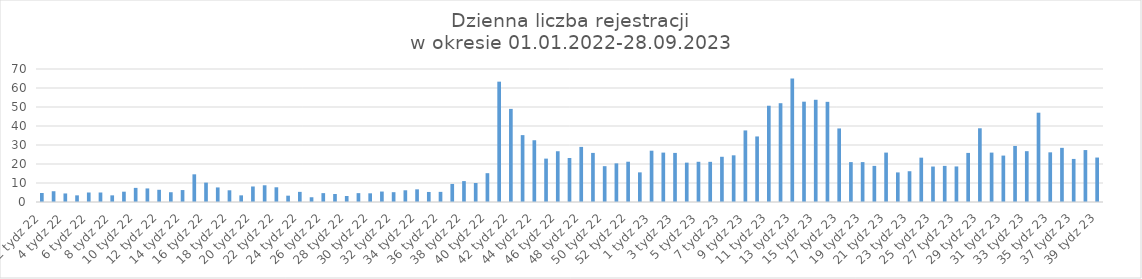
| Category | Series 0 |
|---|---|
| 2 tydz 22 | 4.75 |
| 3 tydz 22 | 5.667 |
| 4 tydz 22 | 4.5 |
| 5 tydz 22 | 3.5 |
| 6 tydz 22 | 5 |
| 7 tydz 22 | 5 |
| 8 tydz 22 | 3.5 |
| 9 tydz 22 | 5.429 |
| 10 tydz 22 | 7.429 |
| 11 tydz 22 | 7.143 |
| 12 tydz 22 | 6.429 |
| 13 tydz 22 | 5.143 |
| 14 tydz 22 | 6.286 |
| 15 tydz 22 | 14.571 |
| 16 tydz 22 | 10.2 |
| 17 tydz 22 | 7.667 |
| 18 tydz 22 | 6.167 |
| 19 tydz 22 | 3.5 |
| 20 tydz 22 | 8.167 |
| 21 tydz 22 | 8.8 |
| 22 tydz 22 | 7.75 |
| 23 tydz 22 | 3.333 |
| 24 tydz 22 | 5.333 |
| 25 tydz 22 | 2.5 |
| 26 tydz 22 | 4.667 |
| 27 tydz 22 | 4.2 |
| 28 tydz 22 | 3.167 |
| 29 tydz 22 | 4.667 |
| 30 tydz 22 | 4.571 |
| 31 tydz 22 | 5.5 |
| 32 tydz 22 | 5.167 |
| 33 tydz 22 | 6.167 |
| 34 tydz 22 | 6.667 |
| 35 tydz 22 | 5.286 |
| 36 tydz 22 | 5.333 |
| 37 tydz 22 | 9.5 |
| 38 tydz 22 | 11 |
| 39 tydz 22 | 10 |
| 40 tydz 22 | 15.167 |
| 41 tydz 22 | 63.333 |
| 42 tydz 22 | 49 |
| 43 tydz 22 | 35.2 |
| 44 tydz 22 | 32.5 |
| 45 tydz 22 | 22.833 |
| 46 tydz 22 | 26.714 |
| 47 tydz 22 | 23.167 |
| 48 tydz 22 | 29 |
| 49 tydz 22 | 25.833 |
| 50 tydz 22 | 18.857 |
| 51 tydz 22 | 20.333 |
| 52 tydz 22 | 21.2 |
| 53 tydz 22 | 15.6 |
| 1 tydz 23 | 27 |
| 2 tydz 23 | 26 |
| 3 tydz 23 | 25.833 |
| 4 tydz 23 | 20.714 |
| 5 tydz 23 | 21.167 |
| 6 tydz 23 | 21.143 |
| 7 tydz 23 | 23.8 |
| 8 tydz 23 | 24.571 |
| 9 tydz 23 | 37.667 |
| 10 tydz 23 | 34.5 |
| 11 tydz 23 | 50.667 |
| 12 tydz 23 | 52 |
| 13 tydz 23 | 65 |
| 14 tydz 23 | 52.8 |
| 15 tydz 23 | 53.8 |
| 16 tydz 23 | 52.714 |
| 17 tydz 23 | 38.714 |
| 18 tydz 23 | 21 |
| 19 tydz 23 | 21 |
| 20 tydz 23 | 19 |
| 21 tydz 23 | 26 |
| 22 tydz 23 | 15.571 |
| 23 tydz 23 | 16.2 |
| 24 tydz 23 | 23.333 |
| 25 tydz 23 | 18.667 |
| 26 tydz 23 | 19 |
| 27 tydz 23 | 18.714 |
| 28 tydz 23 | 25.833 |
| 29 tydz 23 | 38.8 |
| 30 tydz 23 | 26 |
| 31 tydz 23 | 24.429 |
| 32 tydz 23 | 29.5 |
| 33 tydz 23 | 26.75 |
| 34 tydz 23 | 47 |
| 35 tydz 23 | 26.143 |
| 36 tydz 23 | 28.5 |
| 37 tydz 23 | 22.667 |
| 38 tydz 23 | 27.333 |
| 39 tydz 23 | 23.4 |